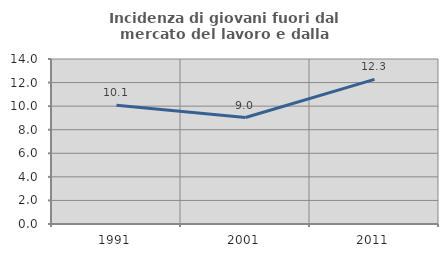
| Category | Incidenza di giovani fuori dal mercato del lavoro e dalla formazione  |
|---|---|
| 1991.0 | 10.067 |
| 2001.0 | 9.032 |
| 2011.0 | 12.27 |